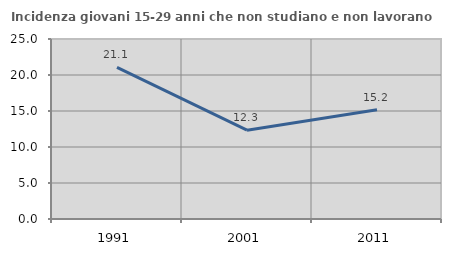
| Category | Incidenza giovani 15-29 anni che non studiano e non lavorano  |
|---|---|
| 1991.0 | 21.053 |
| 2001.0 | 12.341 |
| 2011.0 | 15.185 |